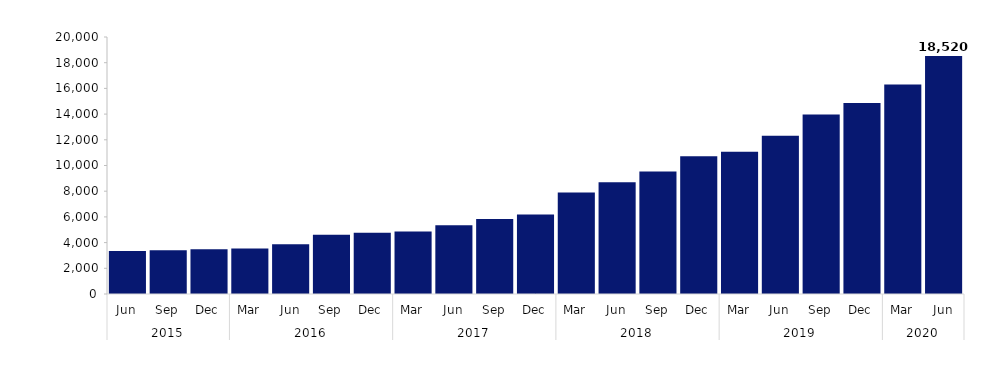
| Category | Series 0 |
|---|---|
| 0 | 3352 |
| 1 | 3399 |
| 2 | 3476 |
| 3 | 3549 |
| 4 | 3877 |
| 5 | 4602 |
| 6 | 4771 |
| 7 | 4865 |
| 8 | 5353 |
| 9 | 5844 |
| 10 | 6182 |
| 11 | 7890 |
| 12 | 8704 |
| 13 | 9536 |
| 14 | 10712 |
| 15 | 11067 |
| 16 | 12311 |
| 17 | 13966 |
| 18 | 14869 |
| 19 | 16309 |
| 20 | 18520 |